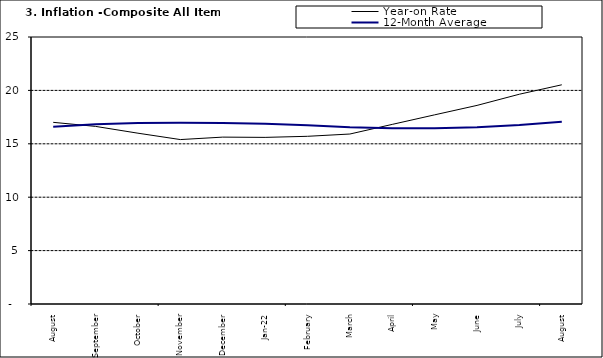
| Category | Year-on Rate | 12-Month Average |
|---|---|---|
| August | 17.009 | 16.601 |
| September | 16.63 | 16.83 |
| October | 15.994 | 16.958 |
| November | 15.396 | 16.979 |
| December | 15.625 | 16.953 |
| Jan-22 | 15.601 | 16.869 |
| February | 15.702 | 16.728 |
| March | 15.915 | 16.544 |
| April | 16.819 | 16.449 |
| May | 17.712 | 16.449 |
| June | 18.596 | 16.542 |
| July | 19.643 | 16.755 |
| August | 20.525 | 17.07 |